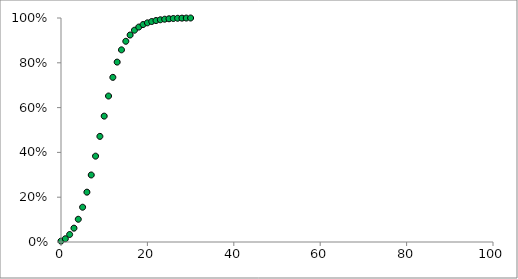
| Category | Series 0 |
|---|---|
| 0.0 | 0.004 |
| 1.0 | 0.014 |
| 2.0 | 0.033 |
| 3.0 | 0.062 |
| 4.0 | 0.101 |
| 5.0 | 0.155 |
| 6.0 | 0.222 |
| 7.0 | 0.299 |
| 8.0 | 0.383 |
| 9.0 | 0.471 |
| 10.0 | 0.562 |
| 11.0 | 0.652 |
| 12.0 | 0.735 |
| 13.0 | 0.803 |
| 14.0 | 0.858 |
| 15.0 | 0.896 |
| 16.0 | 0.924 |
| 17.0 | 0.945 |
| 18.0 | 0.959 |
| 19.0 | 0.971 |
| 20.0 | 0.978 |
| 21.0 | 0.984 |
| 22.0 | 0.989 |
| 23.0 | 0.992 |
| 24.0 | 0.995 |
| 25.0 | 0.996 |
| 26.0 | 0.998 |
| 27.0 | 0.999 |
| 28.0 | 0.999 |
| 29.0 | 1 |
| 30.0 | 1 |